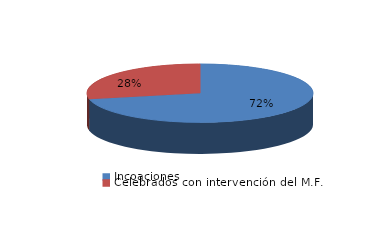
| Category | Series 0 |
|---|---|
| Incoaciones | 652 |
| Celebrados con intervención del M.F. | 258 |